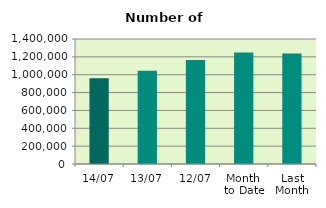
| Category | Series 0 |
|---|---|
| 14/07 | 961548 |
| 13/07 | 1044958 |
| 12/07 | 1163836 |
| Month 
to Date | 1248155.2 |
| Last
Month | 1237407.909 |